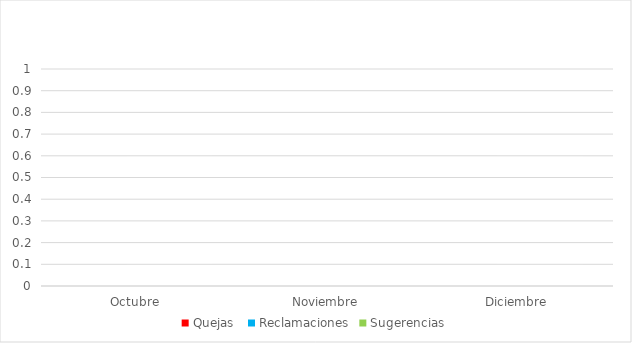
| Category | Quejas  | Reclamaciones | Sugerencias |
|---|---|---|---|
| Octubre | 0 | 0 | 0 |
| Noviembre | 0 | 0 | 0 |
| Diciembre | 0 | 0 | 0 |